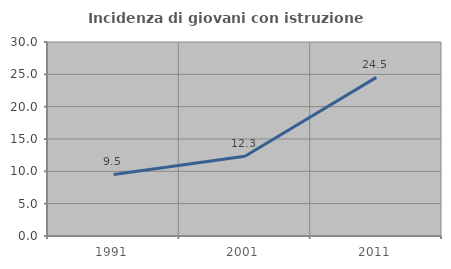
| Category | Incidenza di giovani con istruzione universitaria |
|---|---|
| 1991.0 | 9.524 |
| 2001.0 | 12.346 |
| 2011.0 | 24.528 |